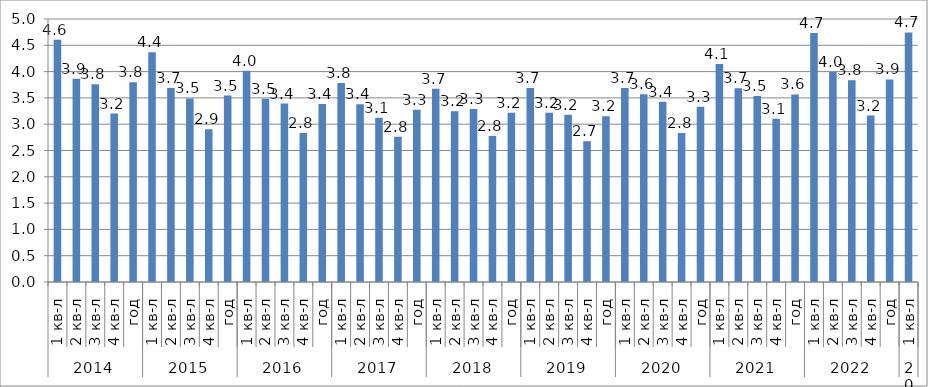
| Category | Series 0 |
|---|---|
| 0 | 4.604 |
| 1 | 3.863 |
| 2 | 3.762 |
| 3 | 3.202 |
| 4 | 3.8 |
| 5 | 4.366 |
| 6 | 3.689 |
| 7 | 3.49 |
| 8 | 2.906 |
| 9 | 3.546 |
| 10 | 4.018 |
| 11 | 3.484 |
| 12 | 3.393 |
| 13 | 2.831 |
| 14 | 3.386 |
| 15 | 3.783 |
| 16 | 3.38 |
| 17 | 3.125 |
| 18 | 2.761 |
| 19 | 3.274 |
| 20 | 3.673 |
| 21 | 3.244 |
| 22 | 3.291 |
| 23 | 2.774 |
| 24 | 3.218 |
| 25 | 3.688 |
| 26 | 3.216 |
| 27 | 3.18 |
| 28 | 2.676 |
| 29 | 3.15 |
| 30 | 3.687 |
| 31 | 3.568 |
| 32 | 3.427 |
| 33 | 2.834 |
| 34 | 3.332 |
| 35 | 4.147 |
| 36 | 3.685 |
| 37 | 3.536 |
| 38 | 3.102 |
| 39 | 3.567 |
| 40 | 4.733 |
| 41 | 3.99 |
| 42 | 3.835 |
| 43 | 3.165 |
| 44 | 3.851 |
| 45 | 4.744 |